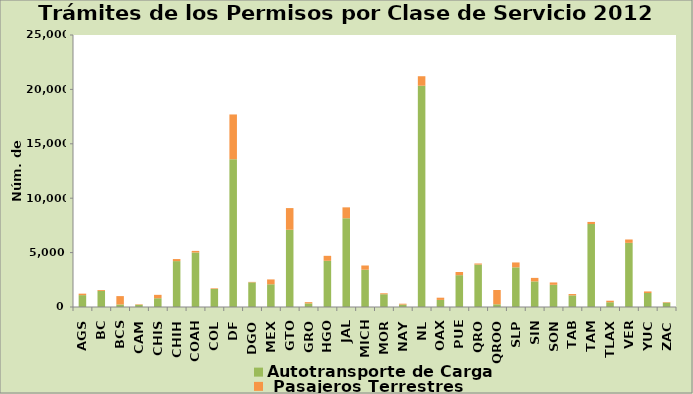
| Category | Autotransporte de Carga  |  Pasajeros Terrestres |
|---|---|---|
| AGS | 1091 | 136 |
| BC | 1482 | 83 |
| BCS | 233 | 768 |
| CAM | 202 | 44 |
| CHIS | 805 | 313 |
| CHIH | 4219 | 188 |
| COAH | 5010 | 147 |
| COL | 1657 | 58 |
| DF | 13581 | 4116 |
| DGO | 2264 | 43 |
| MEX | 2089 | 445 |
| GTO | 7099 | 1993 |
| GRO | 332 | 113 |
| HGO | 4245 | 459 |
| JAL | 8156 | 1003 |
| MICH | 3425 | 390 |
| MOR | 1172 | 88 |
| NAY | 221 | 81 |
| NL | 20337 | 874 |
| OAX | 651 | 204 |
| PUE | 2925 | 290 |
| QRO | 3899 | 99 |
| QROO | 250 | 1314 |
| SLP | 3646 | 448 |
| SIN | 2355 | 321 |
| SON | 2040 | 216 |
| TAB | 1068 | 124 |
| TAM | 7631 | 188 |
| TLAX | 438 | 140 |
| VER | 5896 | 309 |
| YUC | 1288 | 142 |
| ZAC | 402 | 46 |